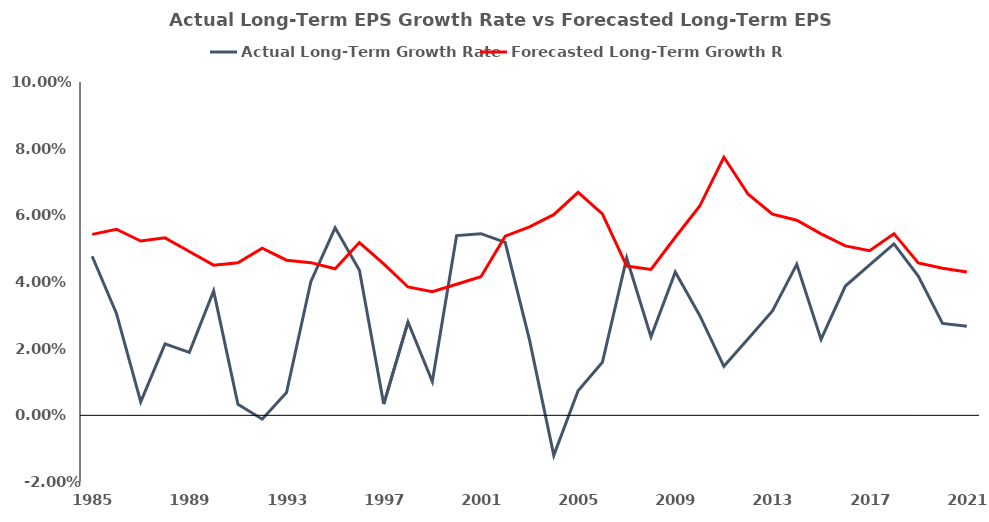
| Category | Actual Long-Term Growth Rate | Forecasted Long-Term Growth Rate |
|---|---|---|
| 1985.0 | 0.048 | 0.054 |
| 1986.0 | 0.031 | 0.056 |
| 1987.0 | 0.004 | 0.052 |
| 1988.0 | 0.021 | 0.053 |
| 1989.0 | 0.019 | 0.049 |
| 1990.0 | 0.037 | 0.045 |
| 1991.0 | 0.003 | 0.046 |
| 1992.0 | -0.001 | 0.05 |
| 1993.0 | 0.007 | 0.047 |
| 1994.0 | 0.04 | 0.046 |
| 1995.0 | 0.056 | 0.044 |
| 1996.0 | 0.044 | 0.052 |
| 1997.0 | 0.003 | 0.045 |
| 1998.0 | 0.028 | 0.039 |
| 1999.0 | 0.01 | 0.037 |
| 2000.0 | 0.054 | 0.039 |
| 2001.0 | 0.054 | 0.042 |
| 2002.0 | 0.052 | 0.054 |
| 2003.0 | 0.023 | 0.057 |
| 2004.0 | -0.012 | 0.06 |
| 2005.0 | 0.007 | 0.067 |
| 2006.0 | 0.016 | 0.06 |
| 2007.0 | 0.047 | 0.045 |
| 2008.0 | 0.024 | 0.044 |
| 2009.0 | 0.043 | 0.053 |
| 2010.0 | 0.03 | 0.063 |
| 2011.0 | 0.015 | 0.077 |
| 2012.0 | 0.023 | 0.066 |
| 2013.0 | 0.031 | 0.06 |
| 2014.0 | 0.045 | 0.059 |
| 2015.0 | 0.023 | 0.054 |
| 2016.0 | 0.039 | 0.051 |
| 2017.0 | 0.045 | 0.049 |
| 2018.0 | 0.051 | 0.055 |
| 2019.0 | 0.042 | 0.046 |
| 2020.0 | 0.028 | 0.044 |
| 2021.0 | 0.027 | 0.043 |